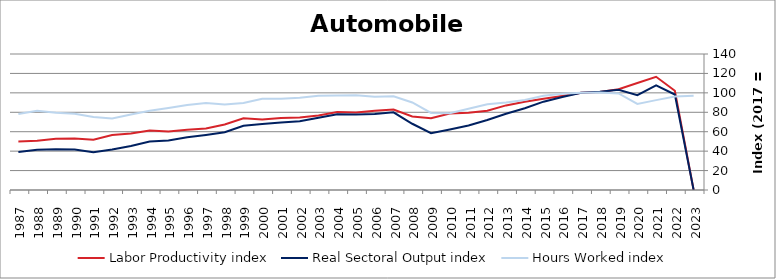
| Category | Labor Productivity index | Real Sectoral Output index | Hours Worked index |
|---|---|---|---|
| 2023.0 | 0 | 0 | 97.034 |
| 2022.0 | 102.168 | 98.3 | 96.214 |
| 2021.0 | 116.544 | 107.828 | 92.522 |
| 2020.0 | 110.109 | 97.625 | 88.662 |
| 2019.0 | 103.718 | 103.085 | 99.39 |
| 2018.0 | 100.766 | 101.26 | 100.49 |
| 2017.0 | 100 | 100 | 100 |
| 2016.0 | 96.814 | 95.826 | 98.979 |
| 2015.0 | 93.818 | 90.924 | 96.915 |
| 2014.0 | 90.853 | 84.21 | 92.688 |
| 2013.0 | 87.081 | 78.448 | 90.086 |
| 2012.0 | 81.559 | 72.041 | 88.33 |
| 2011.0 | 79.404 | 66.446 | 83.681 |
| 2010.0 | 78.772 | 62.296 | 79.084 |
| 2009.0 | 73.864 | 58.556 | 79.275 |
| 2008.0 | 75.648 | 68.189 | 90.14 |
| 2007.0 | 82.917 | 79.947 | 96.418 |
| 2006.0 | 81.458 | 78.249 | 96.06 |
| 2005.0 | 79.875 | 77.819 | 97.426 |
| 2004.0 | 80.207 | 77.97 | 97.212 |
| 2003.0 | 76.776 | 74.398 | 96.903 |
| 2002.0 | 74.545 | 70.821 | 95.005 |
| 2001.0 | 74.002 | 69.497 | 93.912 |
| 2000.0 | 72.476 | 67.999 | 93.824 |
| 1999.0 | 73.818 | 66.104 | 89.55 |
| 1998.0 | 67.457 | 59.392 | 88.044 |
| 1997.0 | 63.282 | 56.708 | 89.612 |
| 1996.0 | 62.025 | 54.271 | 87.499 |
| 1995.0 | 60.222 | 50.885 | 84.495 |
| 1994.0 | 61.253 | 49.967 | 81.574 |
| 1993.0 | 58.242 | 45.28 | 77.745 |
| 1992.0 | 56.536 | 41.667 | 73.7 |
| 1991.0 | 51.838 | 38.898 | 75.038 |
| 1990.0 | 53.07 | 41.714 | 78.602 |
| 1989.0 | 52.829 | 41.997 | 79.497 |
| 1988.0 | 50.774 | 41.38 | 81.498 |
| 1987.0 | 49.882 | 39.055 | 78.295 |